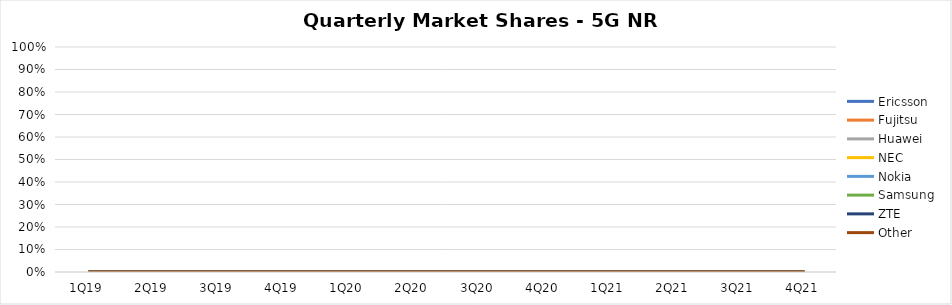
| Category | Ericsson | Fujitsu | Huawei | NEC | Nokia | Samsung | ZTE | Other |
|---|---|---|---|---|---|---|---|---|
| 1Q19 | 0 | 0 | 0 | 0 | 0 | 0 | 0 | 0 |
| 2Q19 | 0 | 0 | 0 | 0 | 0 | 0 | 0 | 0 |
| 3Q19 | 0 | 0 | 0 | 0 | 0 | 0 | 0 | 0 |
| 4Q19 | 0 | 0 | 0 | 0 | 0 | 0 | 0 | 0 |
| 1Q20 | 0 | 0 | 0 | 0 | 0 | 0 | 0 | 0 |
| 2Q20 | 0 | 0 | 0 | 0 | 0 | 0 | 0 | 0 |
| 3Q20 | 0 | 0 | 0 | 0 | 0 | 0 | 0 | 0 |
| 4Q20 | 0 | 0 | 0 | 0 | 0 | 0 | 0 | 0 |
| 1Q21 | 0 | 0 | 0 | 0 | 0 | 0 | 0 | 0 |
| 2Q21 | 0 | 0 | 0 | 0 | 0 | 0 | 0 | 0 |
| 3Q21 | 0 | 0 | 0 | 0 | 0 | 0 | 0 | 0 |
| 4Q21 | 0 | 0 | 0 | 0 | 0 | 0 | 0 | 0 |